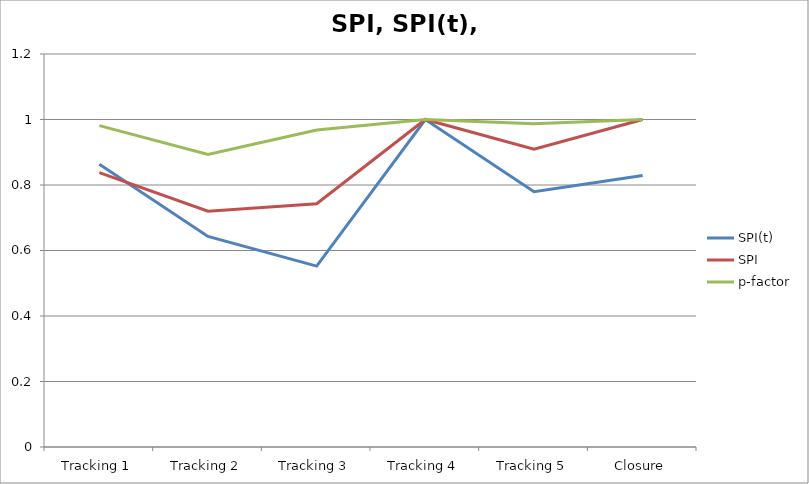
| Category | SPI(t) | SPI | p-factor |
|---|---|---|---|
| Tracking 1 | 0.864 | 0.838 | 0.981 |
| Tracking 2 | 0.643 | 0.72 | 0.893 |
| Tracking 3 | 0.552 | 0.743 | 0.968 |
| Tracking 4 | 1 | 1 | 1 |
| Tracking 5 | 0.779 | 0.909 | 0.987 |
| Closure | 0.829 | 1 | 1 |